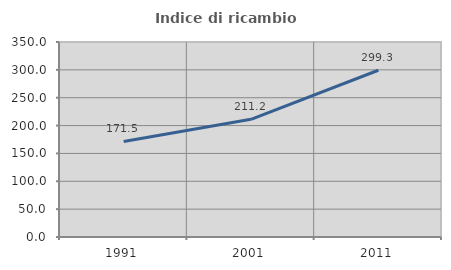
| Category | Indice di ricambio occupazionale  |
|---|---|
| 1991.0 | 171.538 |
| 2001.0 | 211.194 |
| 2011.0 | 299.296 |